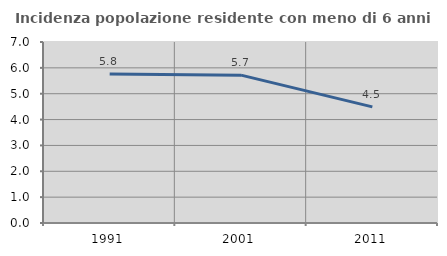
| Category | Incidenza popolazione residente con meno di 6 anni |
|---|---|
| 1991.0 | 5.764 |
| 2001.0 | 5.718 |
| 2011.0 | 4.492 |